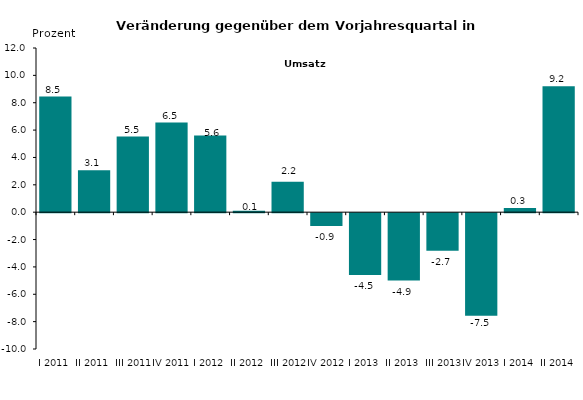
| Category | Series 0 |
|---|---|
| I 2011 | 8.452 |
| II 2011 | 3.069 |
| III 2011 | 5.528 |
| IV 2011 | 6.549 |
| I 2012 | 5.603 |
| II 2012 | 0.11 |
| III 2012 | 2.228 |
| IV 2012 | -0.936 |
| I 2013 | -4.513 |
| II 2013 | -4.922 |
| III 2013 | -2.749 |
| IV 2013 | -7.5 |
| I 2014 | 0.3 |
| II 2014 | 9.2 |